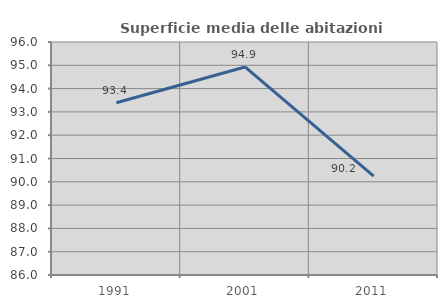
| Category | Superficie media delle abitazioni occupate |
|---|---|
| 1991.0 | 93.395 |
| 2001.0 | 94.929 |
| 2011.0 | 90.246 |